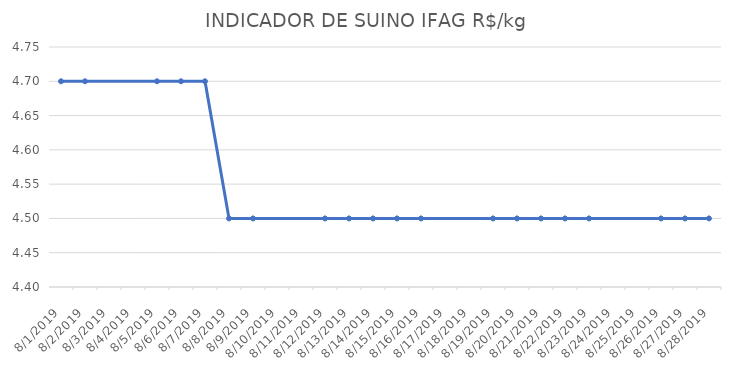
| Category | INDICADOR DE SUINO IFAG |
|---|---|
| 8/1/19 | 4.7 |
| 8/2/19 | 4.7 |
| 8/5/19 | 4.7 |
| 8/6/19 | 4.7 |
| 8/7/19 | 4.7 |
| 8/8/19 | 4.5 |
| 8/9/19 | 4.5 |
| 8/12/19 | 4.5 |
| 8/13/19 | 4.5 |
| 8/14/19 | 4.5 |
| 8/15/19 | 4.5 |
| 8/16/19 | 4.5 |
| 8/19/19 | 4.5 |
| 8/20/19 | 4.5 |
| 8/21/19 | 4.5 |
| 8/22/19 | 4.5 |
| 8/23/19 | 4.5 |
| 8/26/19 | 4.5 |
| 8/27/19 | 4.5 |
| 8/28/19 | 4.5 |